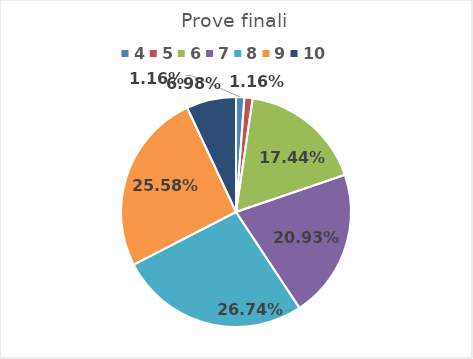
| Category | Series 0 |
|---|---|
| 4.0 | 0.012 |
| 5.0 | 0.012 |
| 6.0 | 0.174 |
| 7.0 | 0.209 |
| 8.0 | 0.267 |
| 9.0 | 0.256 |
| 10.0 | 0.07 |